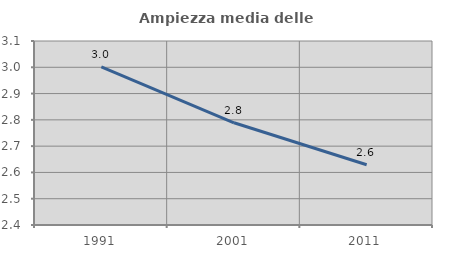
| Category | Ampiezza media delle famiglie |
|---|---|
| 1991.0 | 3.002 |
| 2001.0 | 2.789 |
| 2011.0 | 2.629 |